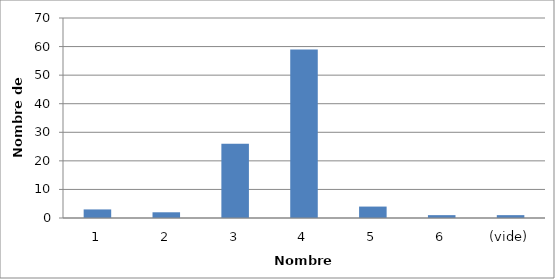
| Category | Total |
|---|---|
| 1 | 3 |
| 2 | 2 |
| 3 | 26 |
| 4 | 59 |
| 5 | 4 |
| 6 | 1 |
| (vide) | 1 |